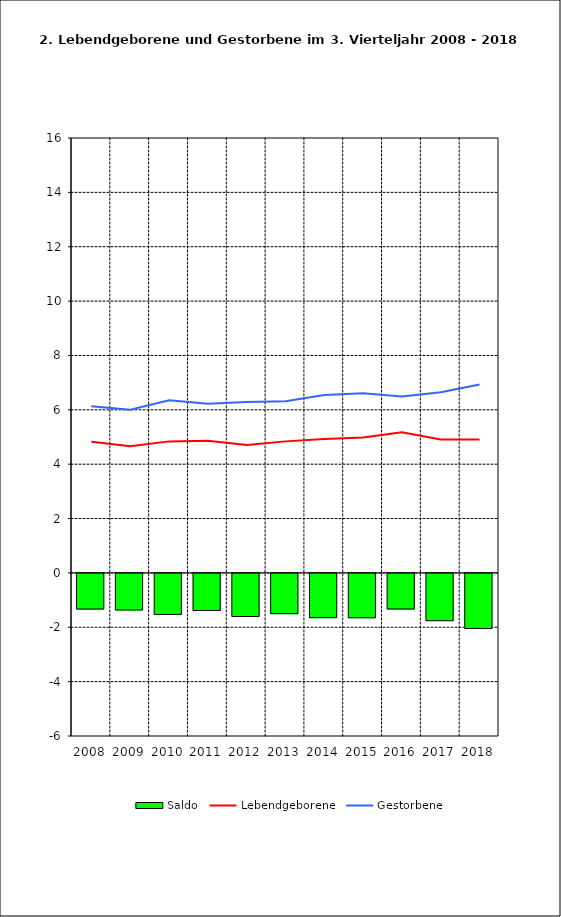
| Category | Saldo |
|---|---|
| 2005.0 | -1.312 |
| 2006.0 | -1.345 |
| 2007.0 | -1.509 |
| 2008.0 | -1.366 |
| 2009.0 | -1.587 |
| 2010.0 | -1.48 |
| 2011.0 | -1.627 |
| 2012.0 | -1.632 |
| 2013.0 | -1.311 |
| 2014.0 | -1.739 |
| 2015.0 | -2.026 |